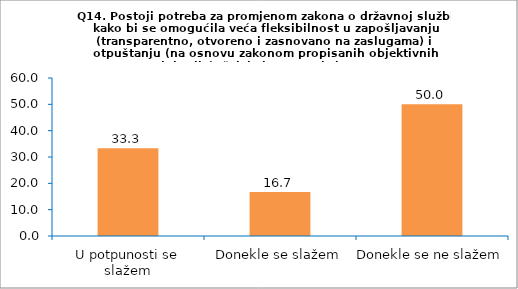
| Category | Series 0 |
|---|---|
| U potpunosti se slažem | 33.333 |
| Donekle se slažem | 16.667 |
| Donekle se ne slažem | 50 |